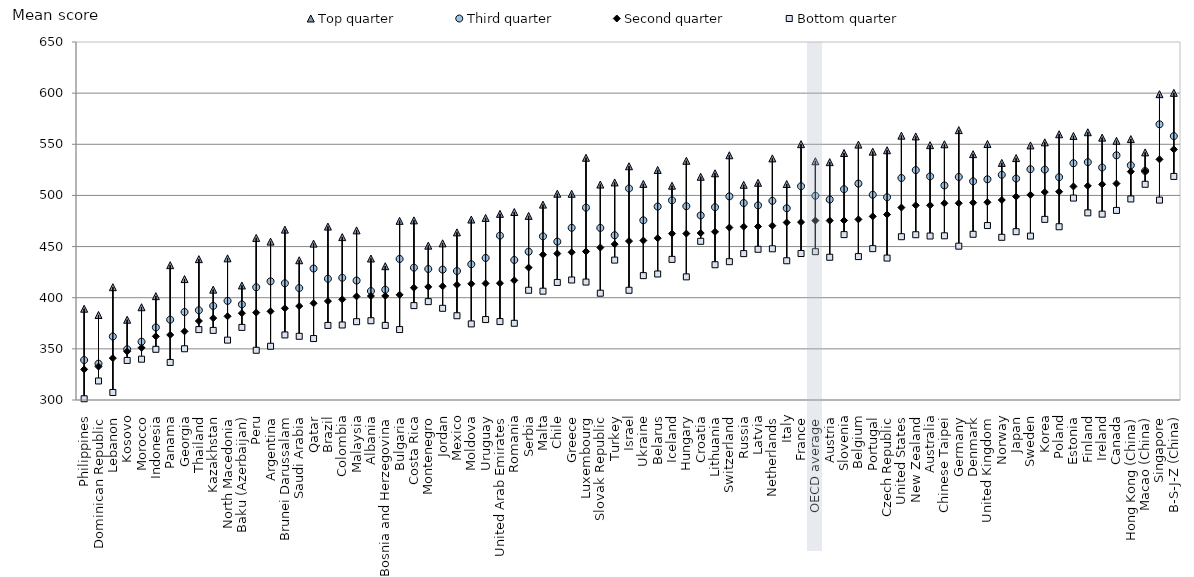
| Category | Top quarter | Third quarter | Second quarter | Bottom quarter |
|---|---|---|---|---|
| Philippines | 389.241 | 339.083 | 329.9 | 301.211 |
| Dominican Republic | 383.122 | 335.517 | 332.714 | 318.591 |
| Lebanon | 410.285 | 362.083 | 340.935 | 307.345 |
| Kosovo | 378.457 | 349.604 | 347.451 | 338.673 |
| Morocco | 390.691 | 356.982 | 351.087 | 339.901 |
| Indonesia | 401.531 | 370.977 | 362.248 | 349.565 |
| Panama | 431.811 | 378.508 | 363.625 | 336.736 |
| Georgia | 418.21 | 386.03 | 367.102 | 350.093 |
| Thailand | 437.709 | 387.728 | 377.224 | 368.82 |
| Kazakhstan | 407.891 | 391.963 | 380.048 | 368.054 |
| North Macedonia | 438.503 | 396.886 | 381.844 | 358.539 |
| Baku (Azerbaijan) | 411.959 | 393.452 | 384.895 | 371.001 |
| Peru | 458.455 | 410.213 | 385.494 | 348.621 |
| Argentina | 454.867 | 416.05 | 386.68 | 352.542 |
| Brunei Darussalam | 466.575 | 414.119 | 389.652 | 363.615 |
| Saudi Arabia | 436.621 | 409.421 | 391.838 | 362.288 |
| Qatar | 452.897 | 428.54 | 394.57 | 360.067 |
| Brazil | 469.533 | 418.557 | 396.66 | 372.921 |
| Colombia | 459.253 | 419.471 | 398.356 | 373.336 |
| Malaysia | 465.84 | 416.77 | 401.321 | 376.568 |
| Albania | 438.316 | 406.501 | 401.658 | 377.486 |
| Bosnia and Herzegovina | 430.813 | 407.868 | 401.724 | 372.936 |
| Bulgaria | 475.149 | 437.874 | 402.843 | 368.864 |
| Costa Rica | 475.621 | 429.38 | 409.756 | 392.277 |
| Montenegro | 450.904 | 428.099 | 410.616 | 396.172 |
| Jordan | 453.185 | 427.477 | 411.179 | 389.645 |
| Mexico | 463.873 | 426.081 | 412.573 | 382.38 |
| Moldova | 476.433 | 432.707 | 413.594 | 374.408 |
| Uruguay | 477.999 | 438.865 | 413.998 | 378.662 |
| United Arab Emirates | 481.995 | 460.71 | 414.154 | 376.674 |
| Romania | 483.788 | 436.906 | 416.929 | 374.993 |
| Serbia | 480.004 | 445.032 | 429.438 | 407.289 |
| Malta | 491.016 | 459.999 | 442.035 | 406.383 |
| Chile | 501.681 | 454.838 | 443.16 | 414.92 |
| Greece | 501.621 | 468.324 | 444.432 | 417.327 |
| Luxembourg | 536.822 | 488.059 | 445.224 | 415.307 |
| Slovak Republic | 510.64 | 468.233 | 449.055 | 404.396 |
| Turkey | 512.69 | 461.091 | 452.321 | 436.775 |
| Israel | 528.515 | 506.783 | 455.372 | 407.279 |
| Ukraine | 511.269 | 475.688 | 455.944 | 421.595 |
| Belarus | 524.921 | 489.118 | 458.174 | 423.193 |
| Iceland | 509.515 | 495.178 | 462.673 | 437.498 |
| Hungary | 533.866 | 489.495 | 462.691 | 420.378 |
| Croatia | 518.238 | 480.474 | 463.219 | 455.153 |
| Lithuania | 521.641 | 488.478 | 464.453 | 432.23 |
| Switzerland | 539.265 | 499.073 | 468.567 | 435.234 |
| Russia | 510.401 | 492.546 | 469.44 | 443.119 |
| Latvia | 512.374 | 490.255 | 469.598 | 447.345 |
| Netherlands | 536.209 | 494.687 | 470.412 | 447.836 |
| Italy | 511.162 | 487.445 | 473.543 | 436.13 |
| France | 550.112 | 508.971 | 473.909 | 443.214 |
| OECD average | 533.406 | 499.679 | 475.381 | 445 |
| Austria | 532.54 | 495.988 | 475.411 | 439.551 |
| Slovenia | 541.481 | 506.102 | 475.539 | 461.682 |
| Belgium | 549.694 | 511.577 | 476.585 | 440.216 |
| Portugal | 542.796 | 500.656 | 479.501 | 447.972 |
| Czech Republic | 544.165 | 498.234 | 481.339 | 438.76 |
| United States | 558.429 | 517.015 | 488.138 | 459.647 |
| New Zealand | 557.675 | 524.748 | 490.339 | 461.581 |
| Australia | 549.14 | 518.602 | 490.345 | 460.329 |
| Chinese Taipei | 550.017 | 509.761 | 492.353 | 460.53 |
| Germany | 563.854 | 518.04 | 492.371 | 450.397 |
| Denmark | 540.355 | 513.787 | 492.881 | 462.022 |
| United Kingdom | 550.298 | 515.774 | 493.334 | 470.549 |
| Norway | 531.809 | 520.149 | 495.529 | 459.063 |
| Japan | 536.514 | 516.525 | 498.829 | 464.545 |
| Sweden | 548.875 | 525.651 | 500.597 | 460.254 |
| Korea | 551.905 | 525.204 | 503.283 | 476.597 |
| Poland | 559.817 | 517.813 | 503.653 | 469.387 |
| Estonia | 558.171 | 531.479 | 508.768 | 497.425 |
| Finland | 561.78 | 532.541 | 509.337 | 482.963 |
| Ireland | 556.511 | 527.29 | 510.838 | 481.696 |
| Canada | 553.404 | 539.225 | 511.642 | 485.346 |
| Hong Kong (China) | 555.085 | 529.458 | 523.283 | 496.548 |
| Macao (China) | 542.09 | 523.941 | 523.777 | 510.89 |
| Singapore | 599.002 | 569.553 | 535.291 | 495.426 |
| B-S-J-Z (China) | 600.32 | 557.981 | 544.992 | 518.569 |